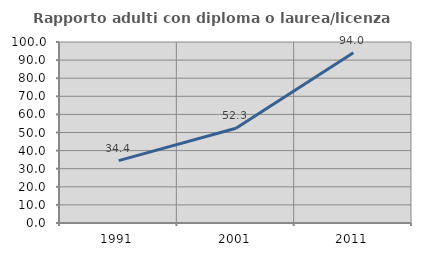
| Category | Rapporto adulti con diploma o laurea/licenza media  |
|---|---|
| 1991.0 | 34.445 |
| 2001.0 | 52.316 |
| 2011.0 | 94.016 |